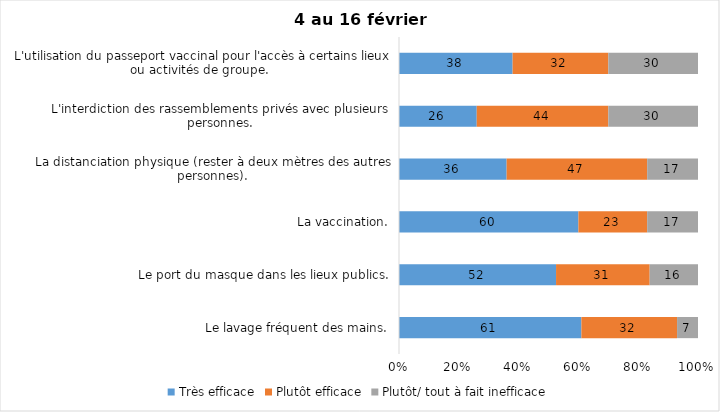
| Category | Très efficace | Plutôt efficace | Plutôt/ tout à fait inefficace |
|---|---|---|---|
| Le lavage fréquent des mains. | 61 | 32 | 7 |
| Le port du masque dans les lieux publics. | 52 | 31 | 16 |
| La vaccination. | 60 | 23 | 17 |
| La distanciation physique (rester à deux mètres des autres personnes). | 36 | 47 | 17 |
| L'interdiction des rassemblements privés avec plusieurs personnes. | 26 | 44 | 30 |
| L'utilisation du passeport vaccinal pour l'accès à certains lieux ou activités de groupe.  | 38 | 32 | 30 |